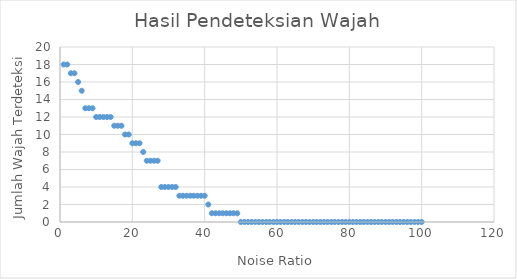
| Category | Jumlah Wajah Terdeteksi |
|---|---|
| 1.0 | 18 |
| 2.0 | 18 |
| 3.0 | 17 |
| 4.0 | 17 |
| 5.0 | 16 |
| 6.0 | 15 |
| 7.0 | 13 |
| 8.0 | 13 |
| 9.0 | 13 |
| 10.0 | 12 |
| 11.0 | 12 |
| 12.0 | 12 |
| 13.0 | 12 |
| 14.0 | 12 |
| 15.0 | 11 |
| 16.0 | 11 |
| 17.0 | 11 |
| 18.0 | 10 |
| 19.0 | 10 |
| 20.0 | 9 |
| 21.0 | 9 |
| 22.0 | 9 |
| 23.0 | 8 |
| 24.0 | 7 |
| 25.0 | 7 |
| 26.0 | 7 |
| 27.0 | 7 |
| 28.0 | 4 |
| 29.0 | 4 |
| 30.0 | 4 |
| 31.0 | 4 |
| 32.0 | 4 |
| 33.0 | 3 |
| 34.0 | 3 |
| 35.0 | 3 |
| 36.0 | 3 |
| 37.0 | 3 |
| 38.0 | 3 |
| 39.0 | 3 |
| 40.0 | 3 |
| 41.0 | 2 |
| 42.0 | 1 |
| 43.0 | 1 |
| 44.0 | 1 |
| 45.0 | 1 |
| 46.0 | 1 |
| 47.0 | 1 |
| 48.0 | 1 |
| 49.0 | 1 |
| 50.0 | 0 |
| 51.0 | 0 |
| 52.0 | 0 |
| 53.0 | 0 |
| 54.0 | 0 |
| 55.0 | 0 |
| 56.0 | 0 |
| 57.0 | 0 |
| 58.0 | 0 |
| 59.0 | 0 |
| 60.0 | 0 |
| 61.0 | 0 |
| 62.0 | 0 |
| 63.0 | 0 |
| 64.0 | 0 |
| 65.0 | 0 |
| 66.0 | 0 |
| 67.0 | 0 |
| 68.0 | 0 |
| 69.0 | 0 |
| 70.0 | 0 |
| 71.0 | 0 |
| 72.0 | 0 |
| 73.0 | 0 |
| 74.0 | 0 |
| 75.0 | 0 |
| 76.0 | 0 |
| 77.0 | 0 |
| 78.0 | 0 |
| 79.0 | 0 |
| 80.0 | 0 |
| 81.0 | 0 |
| 82.0 | 0 |
| 83.0 | 0 |
| 84.0 | 0 |
| 85.0 | 0 |
| 86.0 | 0 |
| 87.0 | 0 |
| 88.0 | 0 |
| 89.0 | 0 |
| 90.0 | 0 |
| 91.0 | 0 |
| 92.0 | 0 |
| 93.0 | 0 |
| 94.0 | 0 |
| 95.0 | 0 |
| 96.0 | 0 |
| 97.0 | 0 |
| 98.0 | 0 |
| 99.0 | 0 |
| 100.0 | 0 |